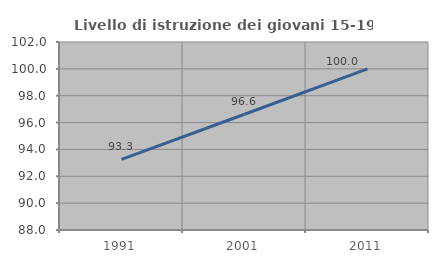
| Category | Livello di istruzione dei giovani 15-19 anni |
|---|---|
| 1991.0 | 93.264 |
| 2001.0 | 96.622 |
| 2011.0 | 100 |